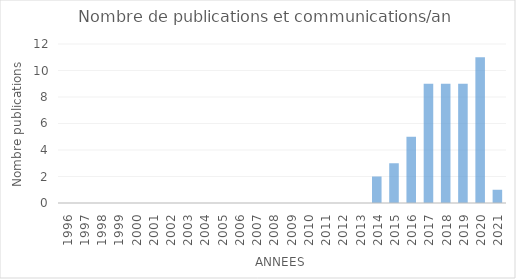
| Category | Series 0 |
|---|---|
| 1996.0 | 0 |
| 1997.0 | 0 |
| 1998.0 | 0 |
| 1999.0 | 0 |
| 2000.0 | 0 |
| 2001.0 | 0 |
| 2002.0 | 0 |
| 2003.0 | 0 |
| 2004.0 | 0 |
| 2005.0 | 0 |
| 2006.0 | 0 |
| 2007.0 | 0 |
| 2008.0 | 0 |
| 2009.0 | 0 |
| 2010.0 | 0 |
| 2011.0 | 0 |
| 2012.0 | 0 |
| 2013.0 | 0 |
| 2014.0 | 2 |
| 2015.0 | 3 |
| 2016.0 | 5 |
| 2017.0 | 9 |
| 2018.0 | 9 |
| 2019.0 | 9 |
| 2020.0 | 11 |
| 2021.0 | 1 |